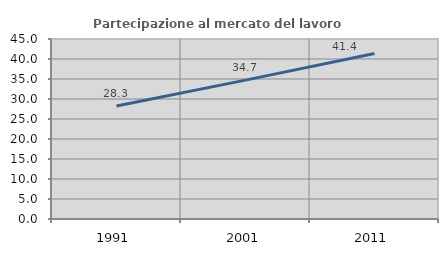
| Category | Partecipazione al mercato del lavoro  femminile |
|---|---|
| 1991.0 | 28.264 |
| 2001.0 | 34.714 |
| 2011.0 | 41.37 |